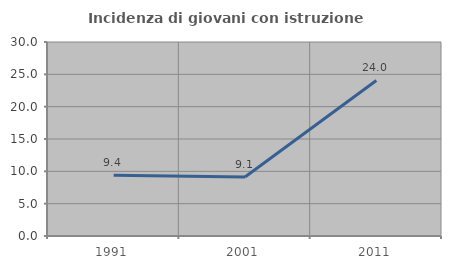
| Category | Incidenza di giovani con istruzione universitaria |
|---|---|
| 1991.0 | 9.39 |
| 2001.0 | 9.122 |
| 2011.0 | 24.048 |